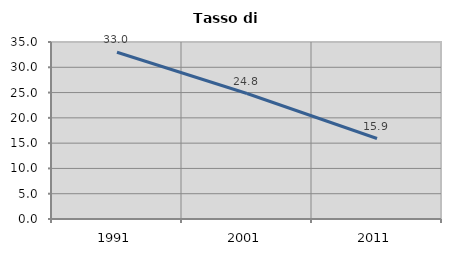
| Category | Tasso di disoccupazione   |
|---|---|
| 1991.0 | 32.965 |
| 2001.0 | 24.81 |
| 2011.0 | 15.915 |